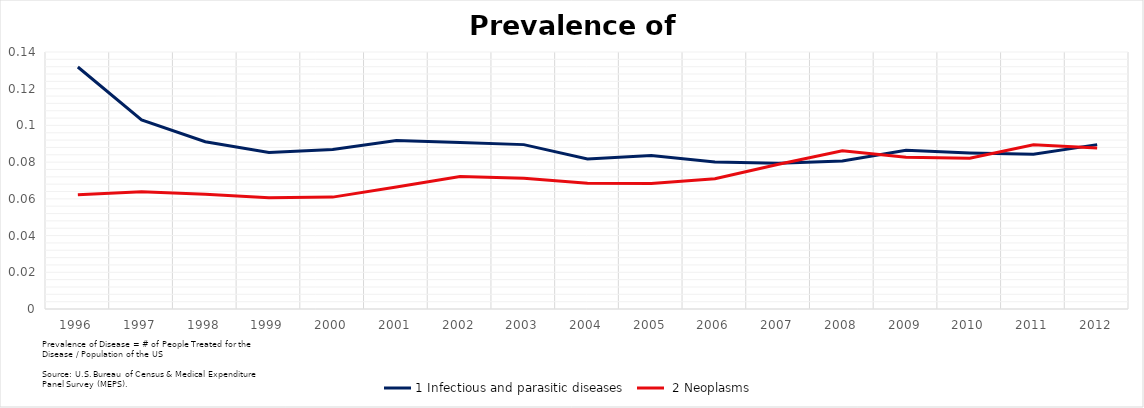
| Category | 1 Infectious and parasitic diseases  |  2 Neoplasms  |
|---|---|---|
| 1996.0 | 0.132 | 0.062 |
| 1997.0 | 0.103 | 0.064 |
| 1998.0 | 0.091 | 0.063 |
| 1999.0 | 0.085 | 0.061 |
| 2000.0 | 0.087 | 0.061 |
| 2001.0 | 0.092 | 0.066 |
| 2002.0 | 0.091 | 0.072 |
| 2003.0 | 0.09 | 0.071 |
| 2004.0 | 0.082 | 0.068 |
| 2005.0 | 0.084 | 0.068 |
| 2006.0 | 0.08 | 0.071 |
| 2007.0 | 0.079 | 0.079 |
| 2008.0 | 0.081 | 0.086 |
| 2009.0 | 0.086 | 0.083 |
| 2010.0 | 0.085 | 0.082 |
| 2011.0 | 0.084 | 0.089 |
| 2012.0 | 0.09 | 0.088 |